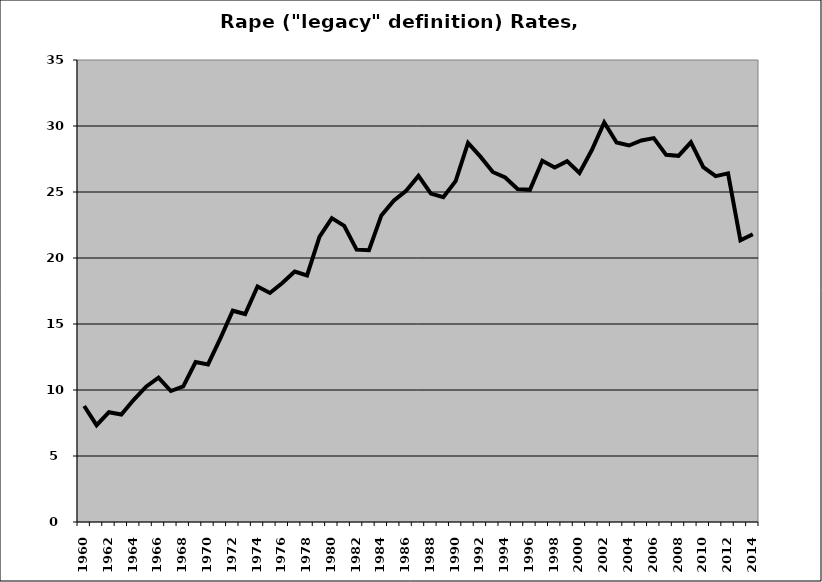
| Category | Rape |
|---|---|
| 1960.0 | 8.79 |
| 1961.0 | 7.333 |
| 1962.0 | 8.316 |
| 1963.0 | 8.141 |
| 1964.0 | 9.259 |
| 1965.0 | 10.252 |
| 1966.0 | 10.939 |
| 1967.0 | 9.923 |
| 1968.0 | 10.272 |
| 1969.0 | 12.116 |
| 1970.0 | 11.938 |
| 1971.0 | 13.915 |
| 1972.0 | 16.007 |
| 1973.0 | 15.754 |
| 1974.0 | 17.837 |
| 1975.0 | 17.35 |
| 1976.0 | 18.108 |
| 1977.0 | 18.973 |
| 1978.0 | 18.681 |
| 1979.0 | 21.592 |
| 1980.0 | 23.021 |
| 1981.0 | 22.438 |
| 1982.0 | 20.632 |
| 1983.0 | 20.588 |
| 1984.0 | 23.225 |
| 1985.0 | 24.348 |
| 1986.0 | 25.099 |
| 1987.0 | 26.223 |
| 1988.0 | 24.877 |
| 1989.0 | 24.61 |
| 1990.0 | 25.821 |
| 1991.0 | 28.718 |
| 1992.0 | 27.679 |
| 1993.0 | 26.519 |
| 1994.0 | 26.095 |
| 1995.0 | 25.232 |
| 1996.0 | 25.166 |
| 1997.0 | 27.363 |
| 1998.0 | 26.856 |
| 1999.0 | 27.339 |
| 2000.0 | 26.439 |
| 2001.0 | 28.18 |
| 2002.0 | 30.262 |
| 2003.0 | 28.745 |
| 2004.0 | 28.521 |
| 2005.0 | 28.907 |
| 2006.0 | 29.082 |
| 2007.0 | 27.814 |
| 2008.0 | 27.741 |
| 2009.0 | 28.767 |
| 2010.0 | 26.885 |
| 2011.0 | 26.201 |
| 2012.0 | 26.409 |
| 2013.0 | 21.344 |
| 2014.0 | 21.795 |